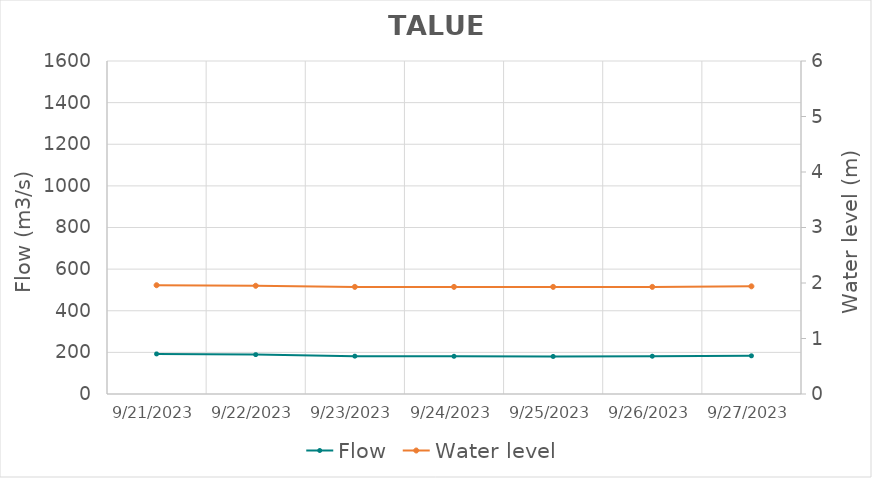
| Category | Flow |
|---|---|
| 7/20/23 | 474.37 |
| 7/19/23 | 483.23 |
| 7/18/23 | 501.64 |
| 7/17/23 | 495.12 |
| 7/16/23 | 496.31 |
| 7/15/23 | 494.23 |
| 7/14/23 | 499.8 |